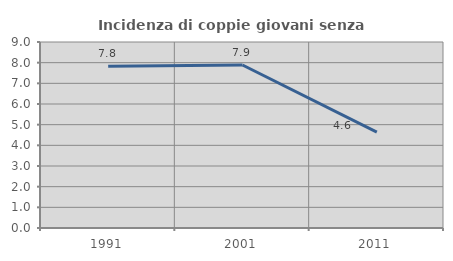
| Category | Incidenza di coppie giovani senza figli |
|---|---|
| 1991.0 | 7.828 |
| 2001.0 | 7.888 |
| 2011.0 | 4.635 |